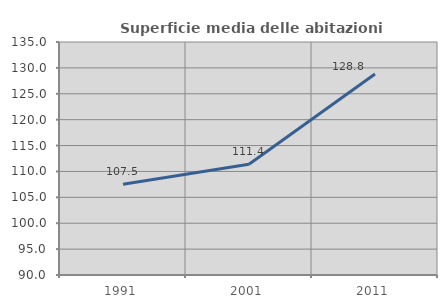
| Category | Superficie media delle abitazioni occupate |
|---|---|
| 1991.0 | 107.508 |
| 2001.0 | 111.383 |
| 2011.0 | 128.807 |